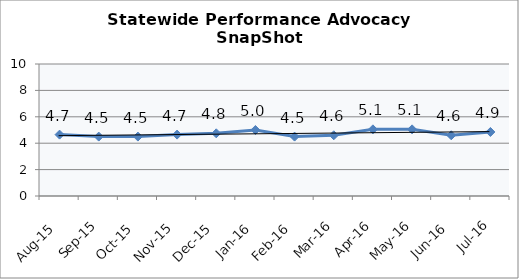
| Category | Statewide |
|---|---|
| Aug-15 | 4.65 |
| Sep-15 | 4.5 |
| Oct-15 | 4.5 |
| Nov-15 | 4.65 |
| Dec-15 | 4.75 |
| Jan-16 | 5 |
| Feb-16 | 4.5 |
| Mar-16 | 4.6 |
| Apr-16 | 5.05 |
| May-16 | 5.05 |
| Jun-16 | 4.6 |
| Jul-16 | 4.85 |